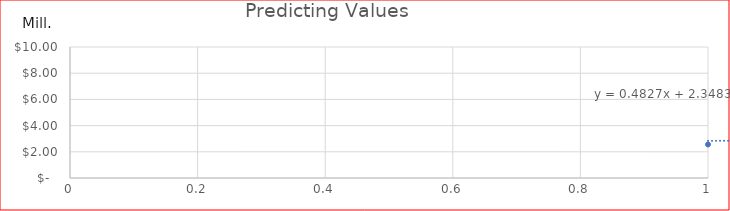
| Category | Series 0 |
|---|---|
| 0 | 2.56 |
| 1 | 3.32 |
| 2 | 4.78 |
| 3 | 5.43 |
| 4 | 4.44 |
| 5 | 4.79 |
| 6 | 3.35 |
| 7 | 6.54 |
| 8 | 5.55 |
| 9 | 8.76 |
| 10 | 8.32 |
| 11 | 7.99 |